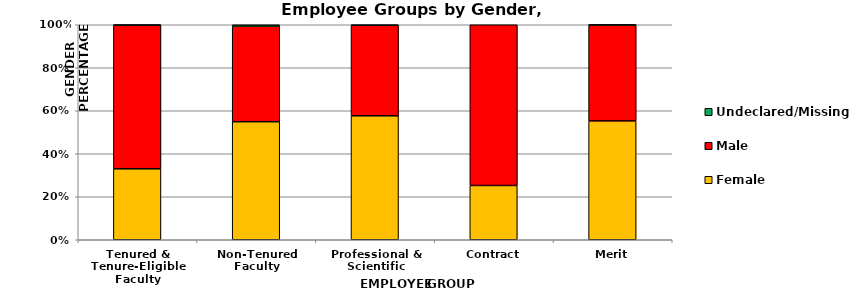
| Category | Female | Male | Undeclared/Missing |
|---|---|---|---|
| Tenured & Tenure-Eligible Faculty | 0.33 | 0.668 | 0.002 |
| Non-Tenured Faculty | 0.549 | 0.444 | 0.007 |
| Professional & Scientific | 0.577 | 0.421 | 0.002 |
| Contract | 0.252 | 0.748 | 0 |
| Merit | 0.553 | 0.446 | 0.001 |